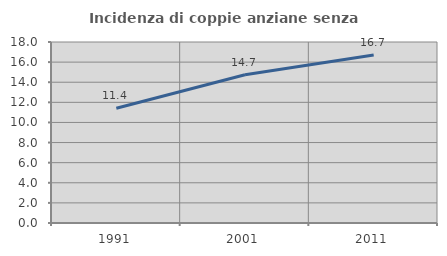
| Category | Incidenza di coppie anziane senza figli  |
|---|---|
| 1991.0 | 11.417 |
| 2001.0 | 14.74 |
| 2011.0 | 16.709 |